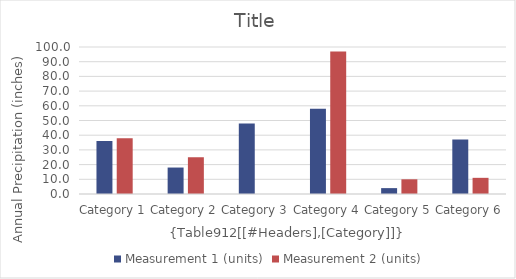
| Category | Measurement 1 (units) | Measurement 2 (units) |
|---|---|---|
| Category 1 | 36 | 38 |
| Category 2 | 18 | 25 |
| Category 3 | 48 | 0 |
| Category 4 | 58 | 97 |
| Category 5 | 4 | 10 |
| Category 6 | 37 | 11 |